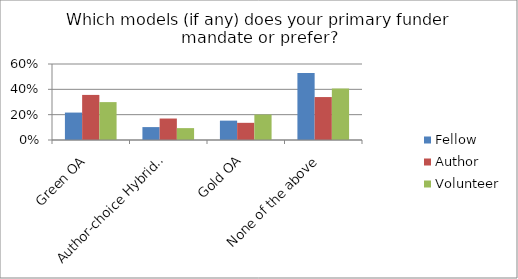
| Category | Fellow | Author | Volunteer |
|---|---|---|---|
| Green OA | 0.217 | 0.356 | 0.299 |
| Author-choice Hybrid OA | 0.102 | 0.169 | 0.094 |
| Gold OA | 0.153 | 0.136 | 0.201 |
| None of the above | 0.529 | 0.339 | 0.406 |